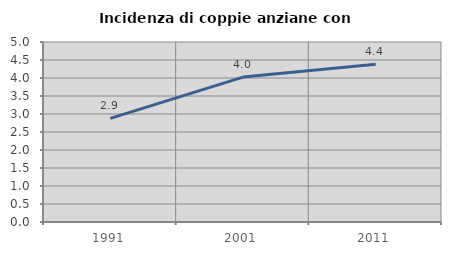
| Category | Incidenza di coppie anziane con figli |
|---|---|
| 1991.0 | 2.877 |
| 2001.0 | 4.026 |
| 2011.0 | 4.38 |